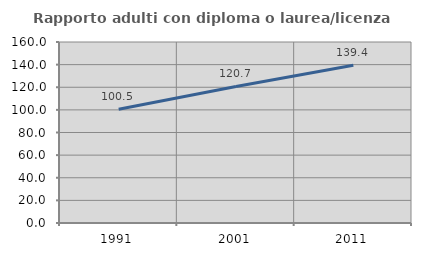
| Category | Rapporto adulti con diploma o laurea/licenza media  |
|---|---|
| 1991.0 | 100.469 |
| 2001.0 | 120.702 |
| 2011.0 | 139.412 |